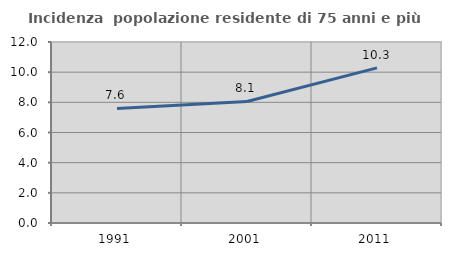
| Category | Incidenza  popolazione residente di 75 anni e più |
|---|---|
| 1991.0 | 7.593 |
| 2001.0 | 8.058 |
| 2011.0 | 10.287 |